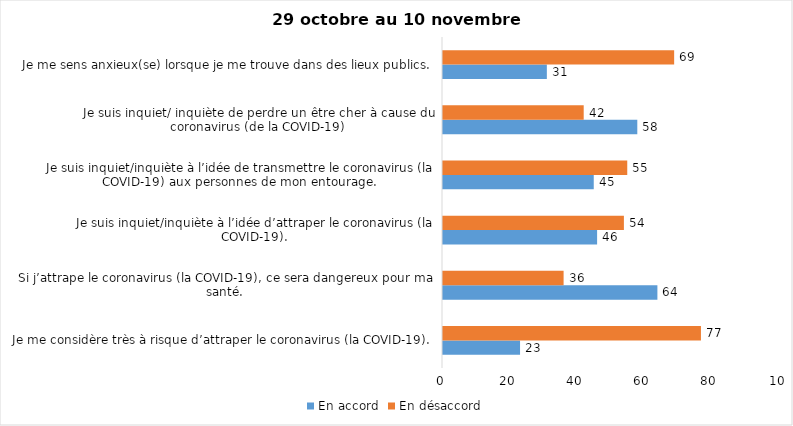
| Category | En accord | En désaccord |
|---|---|---|
| Je me considère très à risque d’attraper le coronavirus (la COVID-19). | 23 | 77 |
| Si j’attrape le coronavirus (la COVID-19), ce sera dangereux pour ma santé. | 64 | 36 |
| Je suis inquiet/inquiète à l’idée d’attraper le coronavirus (la COVID-19). | 46 | 54 |
| Je suis inquiet/inquiète à l’idée de transmettre le coronavirus (la COVID-19) aux personnes de mon entourage. | 45 | 55 |
| Je suis inquiet/ inquiète de perdre un être cher à cause du coronavirus (de la COVID-19) | 58 | 42 |
| Je me sens anxieux(se) lorsque je me trouve dans des lieux publics. | 31 | 69 |